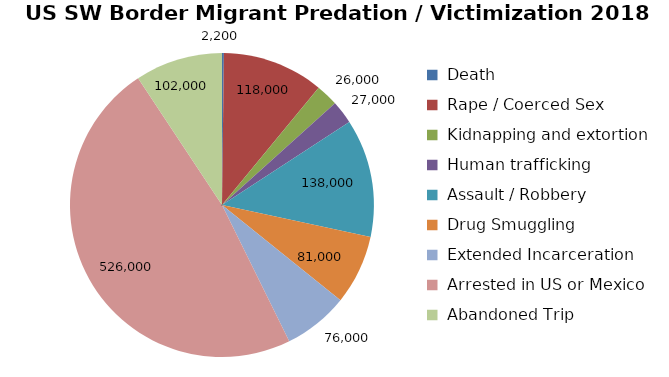
| Category | Series 0 |
|---|---|
|  Death  | 2200 |
|  Rape / Coerced Sex  | 118000 |
|  Kidnapping and extortion  | 26000 |
|  Human trafficking  | 27000 |
|  Assault / Robbery  | 138000 |
|  Drug Smuggling  | 81000 |
|  Extended Incarceration  | 76000 |
|  Arrested in US or Mexico  | 526000 |
|  Abandoned Trip  | 102000 |